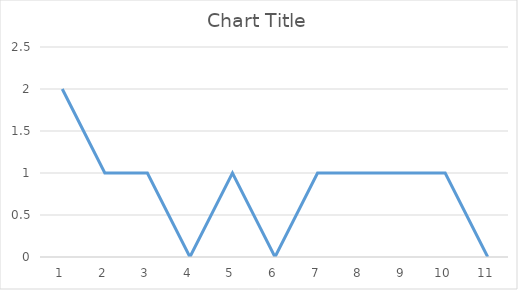
| Category | Series 0 |
|---|---|
| 0 | 2 |
| 1 | 1 |
| 2 | 1 |
| 3 | 0 |
| 4 | 1 |
| 5 | 0 |
| 6 | 1 |
| 7 | 1 |
| 8 | 1 |
| 9 | 1 |
| 10 | 0 |